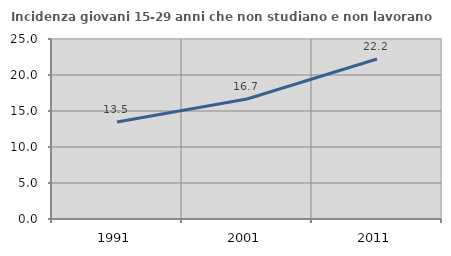
| Category | Incidenza giovani 15-29 anni che non studiano e non lavorano  |
|---|---|
| 1991.0 | 13.466 |
| 2001.0 | 16.667 |
| 2011.0 | 22.222 |